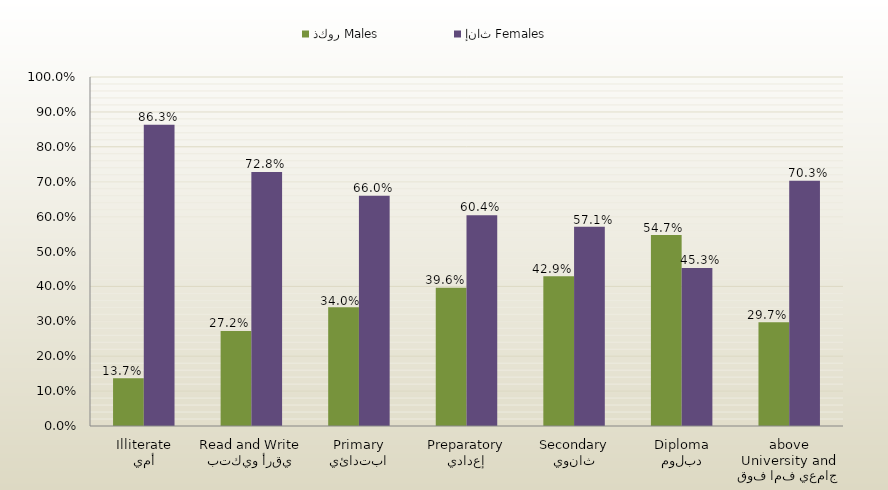
| Category | ذكور Males | إناث Females |
|---|---|---|
| أمي
Illiterate | 0.137 | 0.863 |
| يقرأ ويكتب
Read and Write | 0.272 | 0.728 |
| ابتدائي
Primary | 0.34 | 0.66 |
| إعدادي
Preparatory | 0.396 | 0.604 |
| ثانوي
Secondary | 0.429 | 0.571 |
| دبلوم
Diploma | 0.547 | 0.453 |
| جامعي فما فوق
University and above | 0.297 | 0.703 |